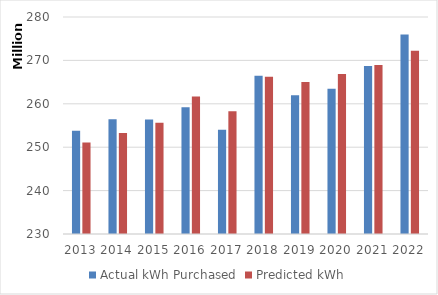
| Category | Actual kWh Purchased | Predicted kWh |
|---|---|---|
| 2013.0 | 253794532.286 | 251057418.866 |
| 2014.0 | 256463675.284 | 253261286.008 |
| 2015.0 | 256374688.637 | 255606326.815 |
| 2016.0 | 259210018.64 | 261704642.1 |
| 2017.0 | 254048366.9 | 258277666.211 |
| 2018.0 | 266473255.972 | 266218412.341 |
| 2019.0 | 261985353.56 | 265019257.761 |
| 2020.0 | 263490930.2 | 266884948.063 |
| 2021.0 | 268727922 | 268938534.649 |
| 2022.0 | 275977471.304 | 272212819.347 |